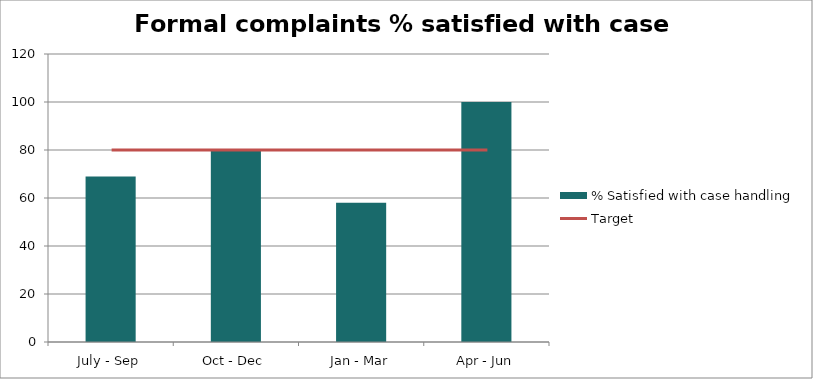
| Category | % Satisfied with case handling |
|---|---|
| July - Sep | 69 |
| Oct - Dec | 80 |
| Jan - Mar | 58 |
| Apr - Jun | 100 |